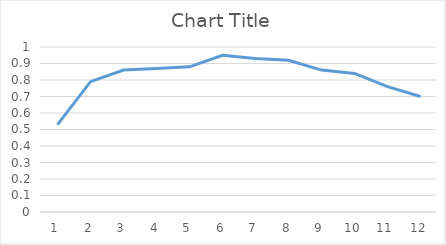
| Category | Series 0 |
|---|---|
| 0 | 0.53 |
| 1 | 0.79 |
| 2 | 0.86 |
| 3 | 0.87 |
| 4 | 0.88 |
| 5 | 0.95 |
| 6 | 0.93 |
| 7 | 0.92 |
| 8 | 0.86 |
| 9 | 0.84 |
| 10 | 0.76 |
| 11 | 0.7 |